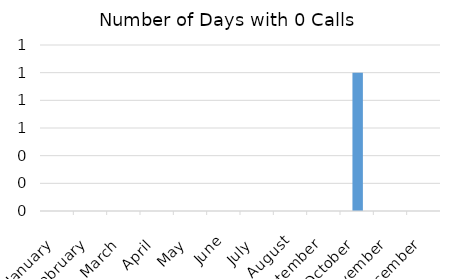
| Category | Number of Days with 0 Calls |
|---|---|
| 1900-01-01 | 0 |
| 1900-02-28 | 0 |
| 1900-03-31 | 0 |
| 1900-04-30 | 0 |
| 1900-05-31 | 0 |
| 1900-06-30 | 0 |
| 1900-07-31 | 0 |
| 1900-08-31 | 0 |
| 1900-09-30 | 0 |
| 1900-10-31 | 1 |
| 1900-11-30 | 0 |
| 1900-12-31 | 0 |